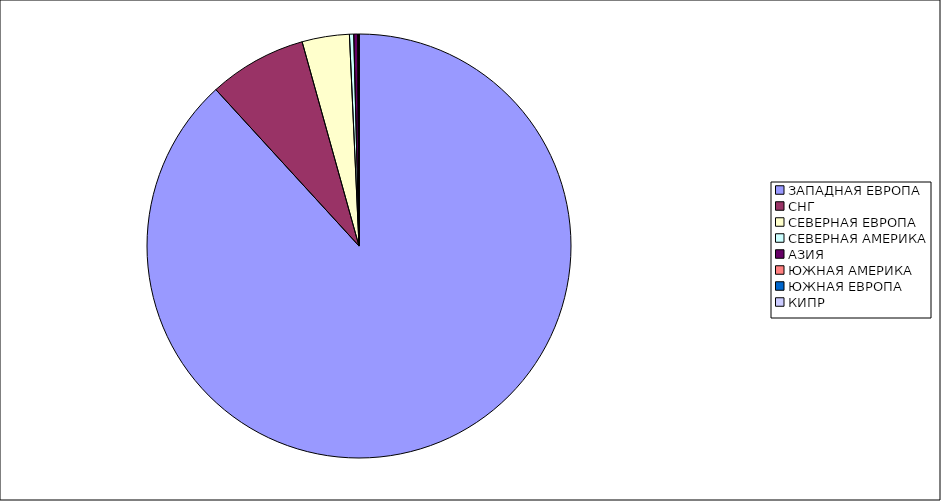
| Category | Оборот |
|---|---|
| ЗАПАДНАЯ ЕВРОПА | 0.882 |
| СНГ | 0.075 |
| СЕВЕРНАЯ ЕВРОПА | 0.036 |
| СЕВЕРНАЯ АМЕРИКА | 0.003 |
| АЗИЯ | 0.003 |
| ЮЖНАЯ АМЕРИКА | 0.001 |
| ЮЖНАЯ ЕВРОПА | 0 |
| КИПР | 0 |